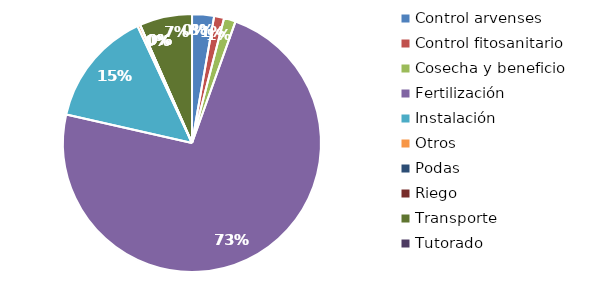
| Category | Valor |
|---|---|
| Control arvenses | 396000 |
| Control fitosanitario | 180000 |
| Cosecha y beneficio | 210000 |
| Fertilización | 10500000 |
| Instalación | 2082600 |
| Otros | 50000 |
| Podas | 0 |
| Riego | 0 |
| Transporte | 948000 |
| Tutorado | 0 |